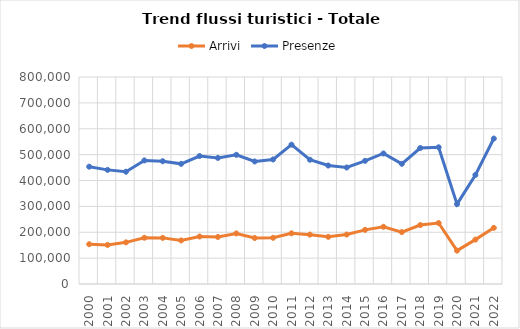
| Category | Arrivi | Presenze |
|---|---|---|
| 2000.0 | 153744 | 453484 |
| 2001.0 | 150899 | 441035 |
| 2002.0 | 160987 | 433926 |
| 2003.0 | 178697 | 477512 |
| 2004.0 | 178231 | 474501 |
| 2005.0 | 168412 | 464371 |
| 2006.0 | 183560 | 494660 |
| 2007.0 | 181733 | 487291 |
| 2008.0 | 195448 | 499260 |
| 2009.0 | 177759 | 473518 |
| 2010.0 | 178533 | 481280 |
| 2011.0 | 195856 | 538478 |
| 2012.0 | 190768 | 480198 |
| 2013.0 | 182173 | 457866 |
| 2014.0 | 191153 | 450256 |
| 2015.0 | 209250 | 476046 |
| 2016.0 | 221186 | 504418 |
| 2017.0 | 200595 | 464493 |
| 2018.0 | 227835 | 525594 |
| 2019.0 | 235633 | 528393 |
| 2020.0 | 128975 | 308713 |
| 2021.0 | 171584 | 421487 |
| 2022.0 | 217002 | 562122 |